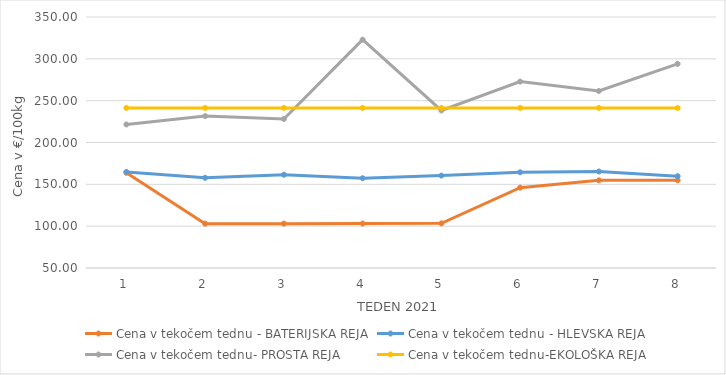
| Category | Cena v tekočem tednu - BATERIJSKA REJA | Cena v tekočem tednu - HLEVSKA REJA | Cena v tekočem tednu- PROSTA REJA | Cena v tekočem tednu-EKOLOŠKA REJA |
|---|---|---|---|---|
| 1.0 | 163.81 | 164.86 | 221.55 | 241.38 |
| 2.0 | 103.02 | 157.81 | 231.55 | 241.38 |
| 3.0 | 103.03 | 161.48 | 228.1 | 241.38 |
| 4.0 | 103.15 | 157.29 | 322.93 | 241.38 |
| 5.0 | 103.34 | 160.43 | 238.28 | 241.38 |
| 6.0 | 146.03 | 164.39 | 272.76 | 241.38 |
| 7.0 | 154.77 | 165.34 | 261.55 | 241.38 |
| 8.0 | 154.86 | 159.79 | 293.97 | 241.38 |